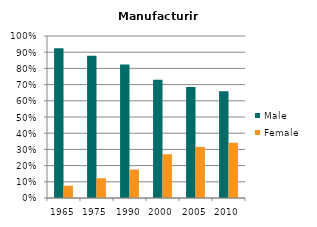
| Category | Male | Female |
|---|---|---|
| 1965.0 | 0.924 | 0.076 |
| 1975.0 | 0.878 | 0.122 |
| 1990.0 | 0.824 | 0.176 |
| 2000.0 | 0.73 | 0.27 |
| 2005.0 | 0.685 | 0.315 |
| 2010.0 | 0.659 | 0.341 |